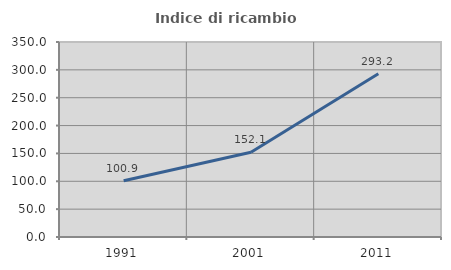
| Category | Indice di ricambio occupazionale  |
|---|---|
| 1991.0 | 100.877 |
| 2001.0 | 152.055 |
| 2011.0 | 293.182 |